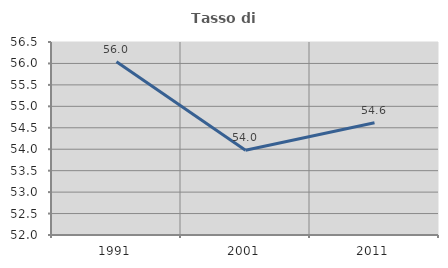
| Category | Tasso di occupazione   |
|---|---|
| 1991.0 | 56.04 |
| 2001.0 | 53.975 |
| 2011.0 | 54.617 |